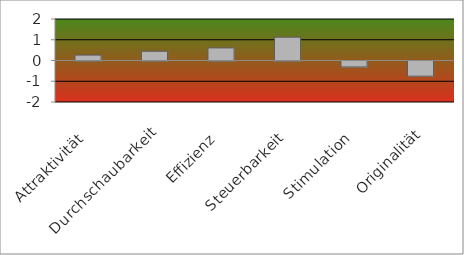
| Category | Series 0 |
|---|---|
| Attraktivität | 0.262 |
| Durchschaubarkeit | 0.446 |
| Effizienz | 0.607 |
| Steuerbarkeit | 1.125 |
| Stimulation | -0.286 |
| Originalität | -0.732 |